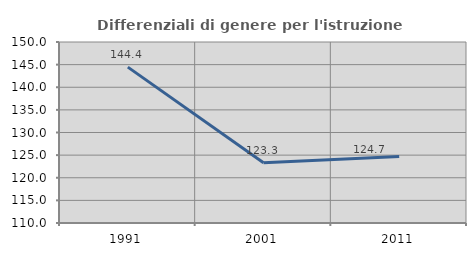
| Category | Differenziali di genere per l'istruzione superiore |
|---|---|
| 1991.0 | 144.443 |
| 2001.0 | 123.322 |
| 2011.0 | 124.699 |